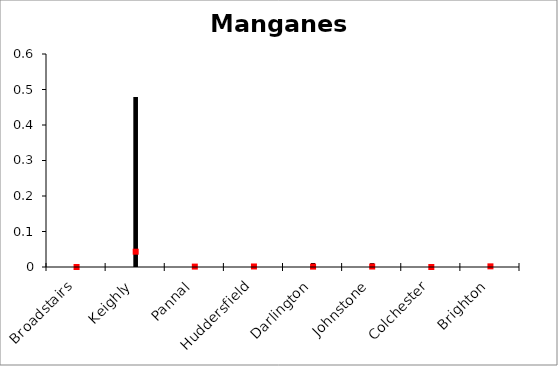
| Category | Manganese | Series 1 | Series 2 |
|---|---|---|---|
| Broadstairs | 0 | 0 | 0 |
| Keighly | 0.479 | 0 | 0.043 |
| Pannal | 0.006 | 0 | 0.001 |
| Huddersfield | 0.008 | 0 | 0.001 |
| Darlington | 0.011 | 0 | 0.001 |
| Johnstone | 0.01 | 0 | 0.001 |
| Colchester | 0 | 0 | 0 |
| Brighton | 0.008 | 0 | 0.002 |